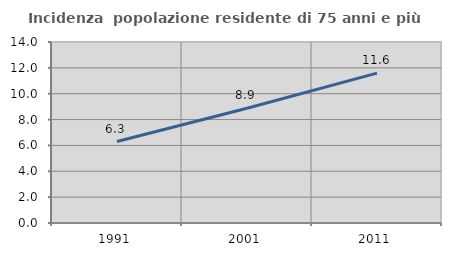
| Category | Incidenza  popolazione residente di 75 anni e più |
|---|---|
| 1991.0 | 6.303 |
| 2001.0 | 8.874 |
| 2011.0 | 11.59 |